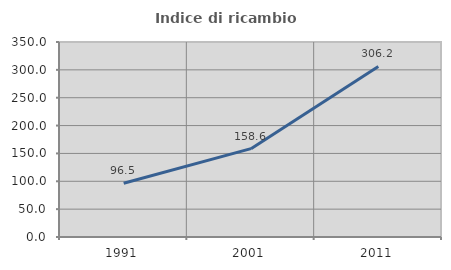
| Category | Indice di ricambio occupazionale  |
|---|---|
| 1991.0 | 96.517 |
| 2001.0 | 158.552 |
| 2011.0 | 306.18 |